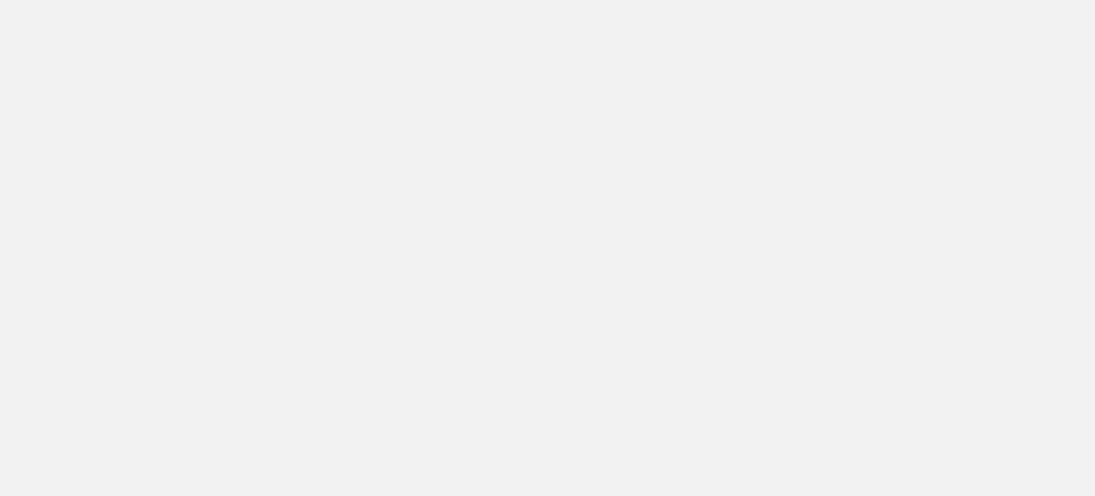
| Category | Total |
|---|---|
| Al Hodeidah | 74810 |
| Hajjah | 72701 |
| Marib | 49268 |
| Al Jawf | 14979 |
| Taiz | 14905 |
| Hadramawt | 9088 |
| Sadah | 7430 |
| Amran | 5302 |
| Aden | 5210 |
| Lahj | 4804 |
| Abyan | 4181 |
| Sanaa | 3970 |
| Ad Dali | 3681 |
| Ibb | 2686 |
| Dhamar | 2191 |
| Al Bayda | 1900 |
| Shabwah | 1118 |
| Al Mahwit | 681 |
| Al Maharah | 457 |
| Raymah | 450 |
| Sanaa City | 167 |
| Socotra | 15 |